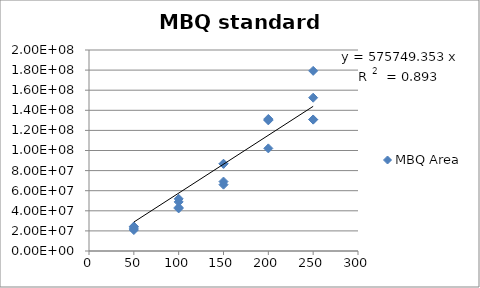
| Category | MBQ Area |
|---|---|
| 250.0 | 179256898.53 |
| 250.0 | 130877194.459 |
| 250.0 | 152548666.134 |
| 250.0 | 130685272.075 |
| 200.0 | 130597484.533 |
| 200.0 | 130007212.83 |
| 200.0 | 102106232.626 |
| 200.0 | 131397116.406 |
| 150.0 | 69096849.764 |
| 150.0 | 66012357.507 |
| 150.0 | 86738313.608 |
| 150.0 | 86807661.271 |
| 100.0 | 43274995.971 |
| 100.0 | 48852118.356 |
| 100.0 | 42367466.078 |
| 100.0 | 51927634.527 |
| 50.0 | 23855688 |
| 50.0 | 22029877 |
| 50.0 | 24426538 |
| 50.0 | 20848460 |